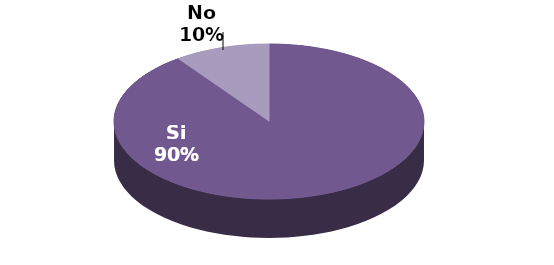
| Category | Series 1 |
|---|---|
| Si | 18 |
| No | 2 |